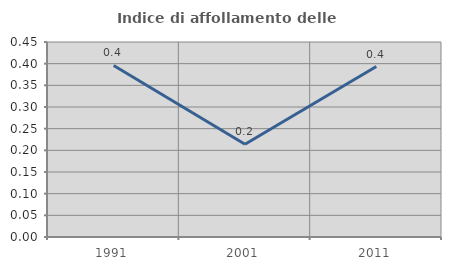
| Category | Indice di affollamento delle abitazioni  |
|---|---|
| 1991.0 | 0.396 |
| 2001.0 | 0.214 |
| 2011.0 | 0.393 |